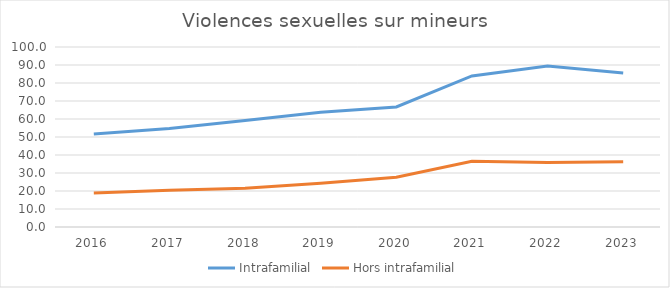
| Category | Intrafamilial | Hors intrafamilial |
|---|---|---|
| 2016.0 | 51.706 | 18.829 |
| 2017.0 | 54.772 | 20.471 |
| 2018.0 | 59.17 | 21.472 |
| 2019.0 | 63.703 | 24.243 |
| 2020.0 | 66.669 | 27.636 |
| 2021.0 | 83.899 | 36.537 |
| 2022.0 | 89.391 | 35.888 |
| 2023.0 | 85.531 | 36.204 |